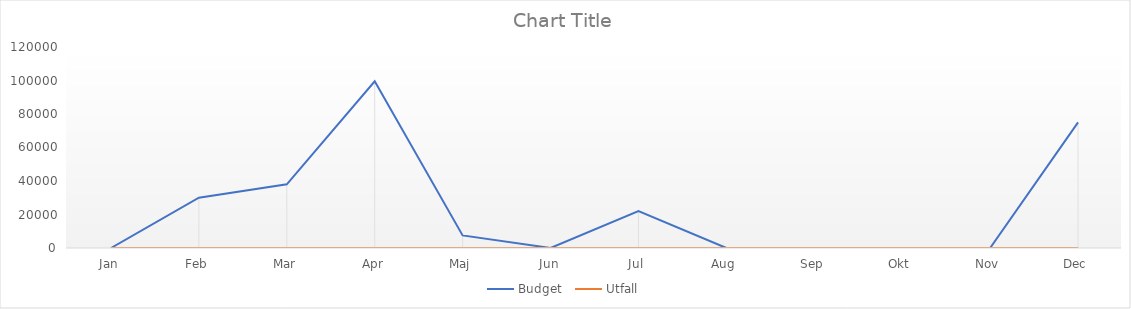
| Category | Budget  | Utfall |
|---|---|---|
| Jan | 0 | 0 |
| Feb | 30000 | 0 |
| Mar | 38000 | 0 |
| Apr | 99500 | 0 |
| Maj | 7500 | 0 |
| Jun | 0 | 0 |
| Jul | 22000 | 0 |
| Aug | 0 | 0 |
| Sep | 0 | 0 |
| Okt | 0 | 0 |
| Nov | 0 | 0 |
| Dec | 75000 | 0 |